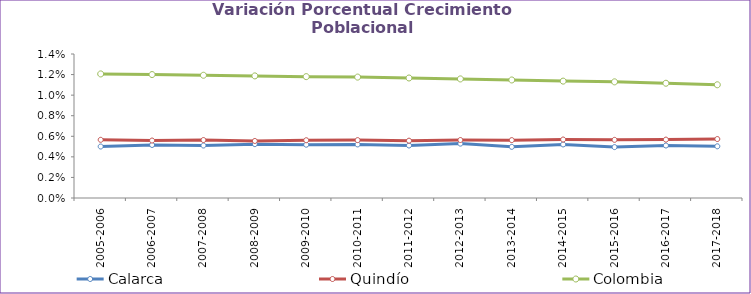
| Category | Calarca | Quindío | Colombia |
|---|---|---|---|
| 2005-2006 | 0.005 | 0.006 | 0.012 |
| 2006-2007 | 0.005 | 0.006 | 0.012 |
| 2007-2008 | 0.005 | 0.006 | 0.012 |
| 2008-2009 | 0.005 | 0.006 | 0.012 |
| 2009-2010 | 0.005 | 0.006 | 0.012 |
| 2010-2011 | 0.005 | 0.006 | 0.012 |
| 2011-2012 | 0.005 | 0.006 | 0.012 |
| 2012-2013 | 0.005 | 0.006 | 0.012 |
| 2013-2014 | 0.005 | 0.006 | 0.011 |
| 2014-2015 | 0.005 | 0.006 | 0.011 |
| 2015-2016 | 0.005 | 0.006 | 0.011 |
| 2016-2017 | 0.005 | 0.006 | 0.011 |
| 2017-2018 | 0.005 | 0.006 | 0.011 |